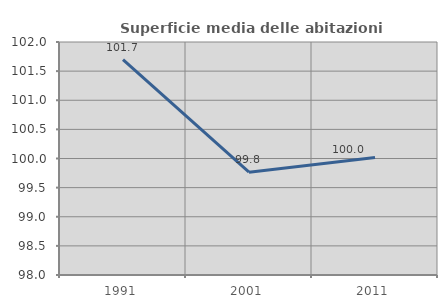
| Category | Superficie media delle abitazioni occupate |
|---|---|
| 1991.0 | 101.698 |
| 2001.0 | 99.765 |
| 2011.0 | 100.017 |